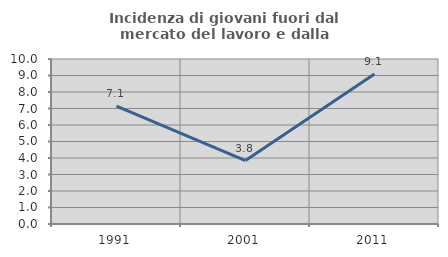
| Category | Incidenza di giovani fuori dal mercato del lavoro e dalla formazione  |
|---|---|
| 1991.0 | 7.143 |
| 2001.0 | 3.846 |
| 2011.0 | 9.091 |